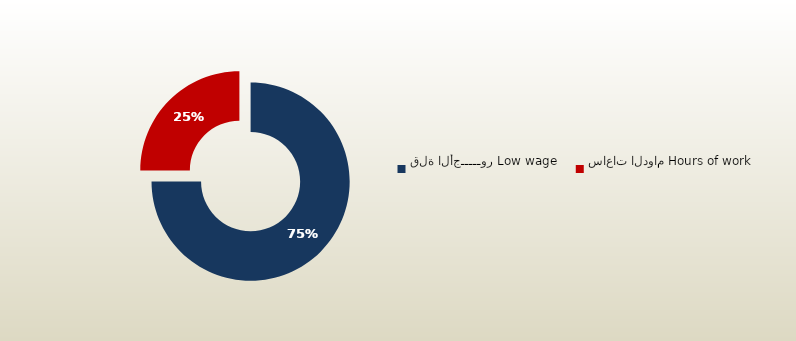
| Category | المجموع
Total |
|---|---|
| قلة الأجـــــور Low wage | 192 |
| ساعات الدوام Hours of work | 64 |